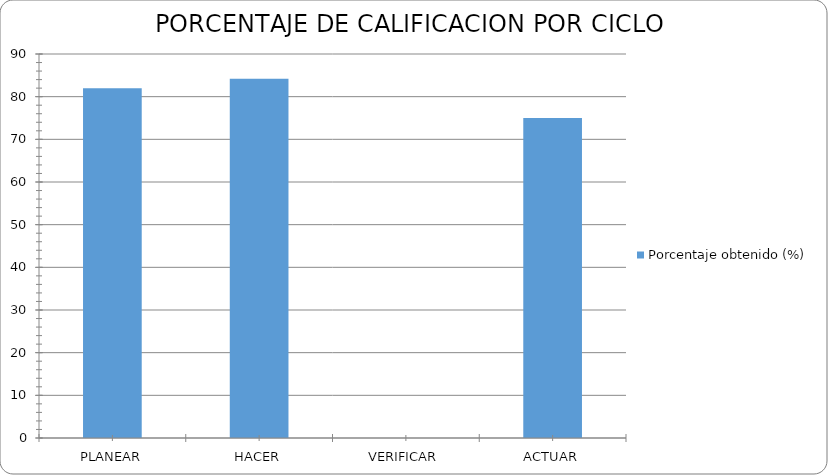
| Category | Porcentaje obtenido (%) |
|---|---|
| PLANEAR | 82 |
| HACER | 84.17 |
| VERIFICAR | 0 |
| ACTUAR | 75 |